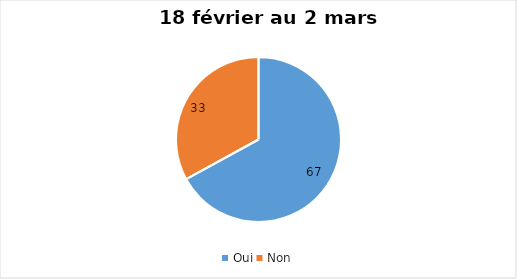
| Category | 18 février au 2 mars |
|---|---|
| Oui | 67 |
| Non | 33 |